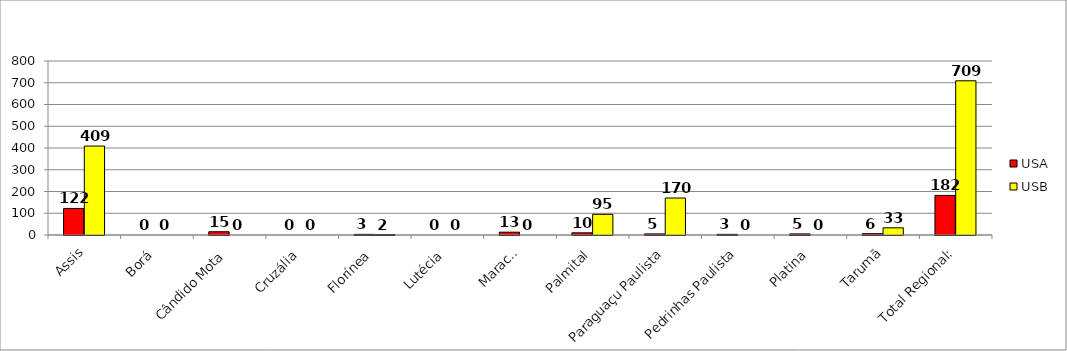
| Category | USA | USB |
|---|---|---|
| Assis | 122 | 409 |
| Borá | 0 | 0 |
| Cândido Mota | 15 | 0 |
| Cruzália | 0 | 0 |
| Florínea | 3 | 2 |
| Lutécia | 0 | 0 |
| Maracaí | 13 | 0 |
| Palmital | 10 | 95 |
| Paraguaçu Paulista | 5 | 170 |
| Pedrinhas Paulista | 3 | 0 |
| Platina | 5 | 0 |
| Tarumã | 6 | 33 |
| Total Regional: | 182 | 709 |